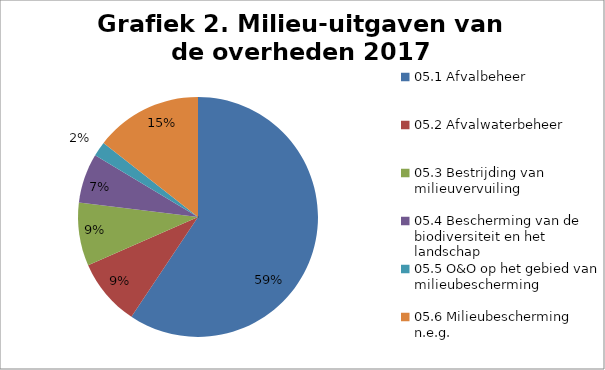
| Category | Series 0 |
|---|---|
| 05.1 Afvalbeheer | 2383 |
| 05.2 Afvalwaterbeheer | 363.6 |
| 05.3 Bestrijding van milieuvervuiling | 341.7 |
| 05.4 Bescherming van de biodiversiteit en het landschap | 268 |
| 05.5 O&O op het gebied van milieubescherming | 79.2 |
| 05.6 Milieubescherming n.e.g. | 578.9 |